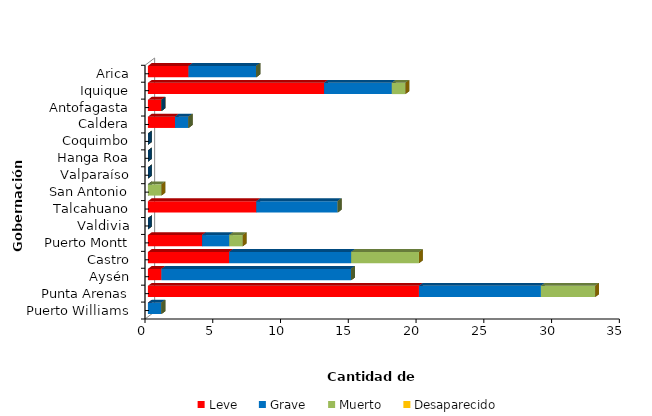
| Category | Leve | Grave | Muerto | Desaparecido |
|---|---|---|---|---|
| Arica | 3 | 5 | 0 | 0 |
| Iquique | 13 | 5 | 1 | 0 |
| Antofagasta | 1 | 0 | 0 | 0 |
| Caldera | 2 | 1 | 0 | 0 |
| Coquimbo | 0 | 0 | 0 | 0 |
| Hanga Roa | 0 | 0 | 0 | 0 |
| Valparaíso | 0 | 0 | 0 | 0 |
| San Antonio | 0 | 0 | 1 | 0 |
| Talcahuano | 8 | 6 | 0 | 0 |
| Valdivia | 0 | 0 | 0 | 0 |
| Puerto Montt | 4 | 2 | 1 | 0 |
| Castro | 6 | 9 | 5 | 0 |
| Aysén | 1 | 14 | 0 | 0 |
| Punta Arenas | 20 | 9 | 4 | 0 |
| Puerto Williams | 0 | 1 | 0 | 0 |